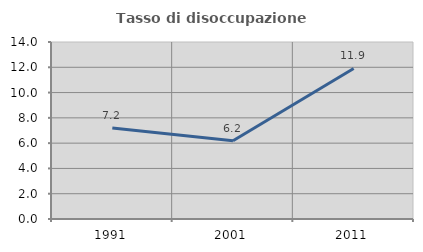
| Category | Tasso di disoccupazione giovanile  |
|---|---|
| 1991.0 | 7.2 |
| 2001.0 | 6.186 |
| 2011.0 | 11.905 |